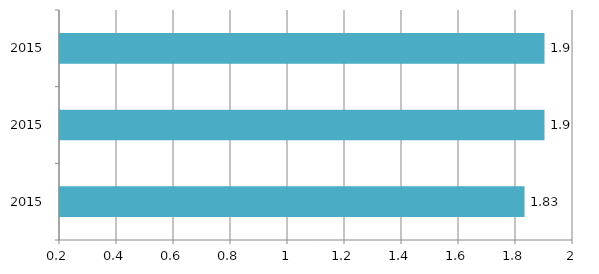
| Category | Series 0 |
|---|---|
| 2015.0 | 1.83 |
| 2015.0 | 1.9 |
| 2015.0 | 1.9 |